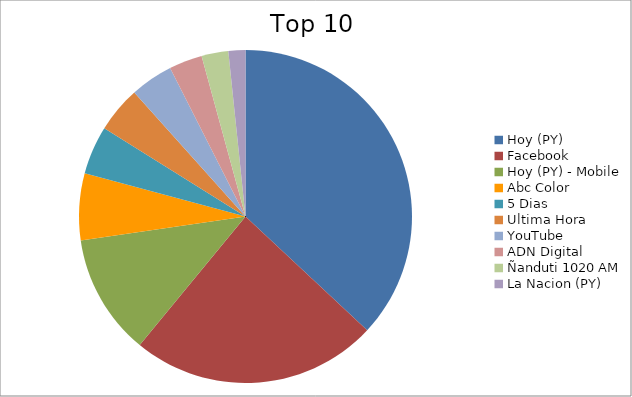
| Category | Series 0 |
|---|---|
| Hoy (PY) | 32.96 |
| Facebook | 21.4 |
| Hoy (PY) - Mobile | 10.48 |
| Abc Color | 5.77 |
| 5 Dias | 4.2 |
| Ultima Hora | 3.99 |
| YouTube | 3.71 |
| ADN Digital | 2.88 |
| Ñanduti 1020 AM | 2.32 |
| La Nacion (PY) | 1.47 |